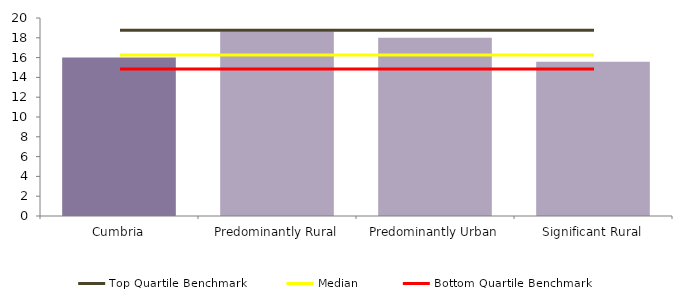
| Category | Series 0 |
|---|---|
| Cumbria | 16.018 |
| Predominantly Rural | 18.627 |
| Predominantly Urban | 17.998 |
| Significant Rural | 15.588 |